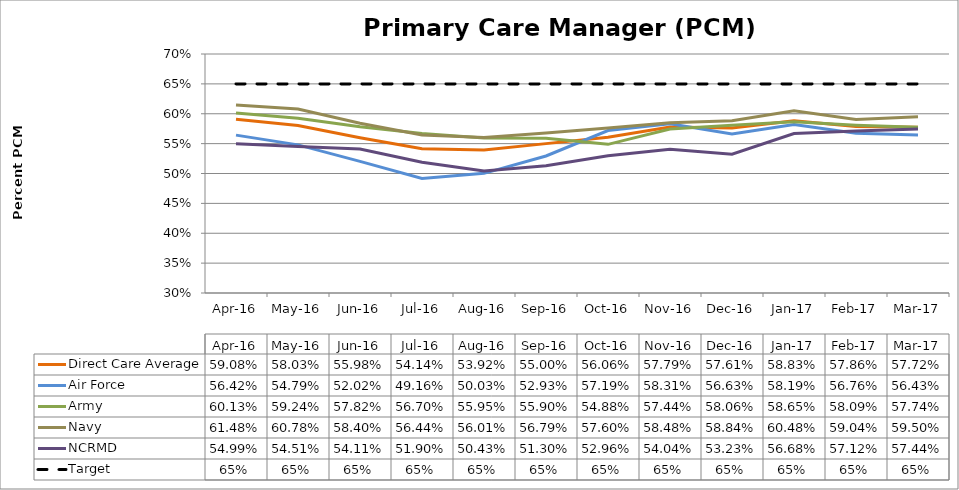
| Category | Direct Care Average | Air Force | Army | Navy | NCRMD | Target |
|---|---|---|---|---|---|---|
| 2016-04-01 | 0.591 | 0.564 | 0.601 | 0.615 | 0.55 | 0.65 |
| 2016-05-01 | 0.58 | 0.548 | 0.592 | 0.608 | 0.545 | 0.65 |
| 2016-06-01 | 0.56 | 0.52 | 0.578 | 0.584 | 0.541 | 0.65 |
| 2016-07-01 | 0.541 | 0.492 | 0.567 | 0.564 | 0.519 | 0.65 |
| 2016-08-01 | 0.539 | 0.5 | 0.559 | 0.56 | 0.504 | 0.65 |
| 2016-09-01 | 0.55 | 0.529 | 0.559 | 0.568 | 0.513 | 0.65 |
| 2016-10-01 | 0.561 | 0.572 | 0.549 | 0.576 | 0.53 | 0.65 |
| 2016-11-01 | 0.578 | 0.583 | 0.574 | 0.585 | 0.54 | 0.65 |
| 2016-12-01 | 0.576 | 0.566 | 0.581 | 0.588 | 0.532 | 0.65 |
| 2017-01-01 | 0.588 | 0.582 | 0.587 | 0.605 | 0.567 | 0.65 |
| 2017-02-01 | 0.579 | 0.568 | 0.581 | 0.59 | 0.571 | 0.65 |
| 2017-03-01 | 0.577 | 0.564 | 0.577 | 0.595 | 0.574 | 0.65 |